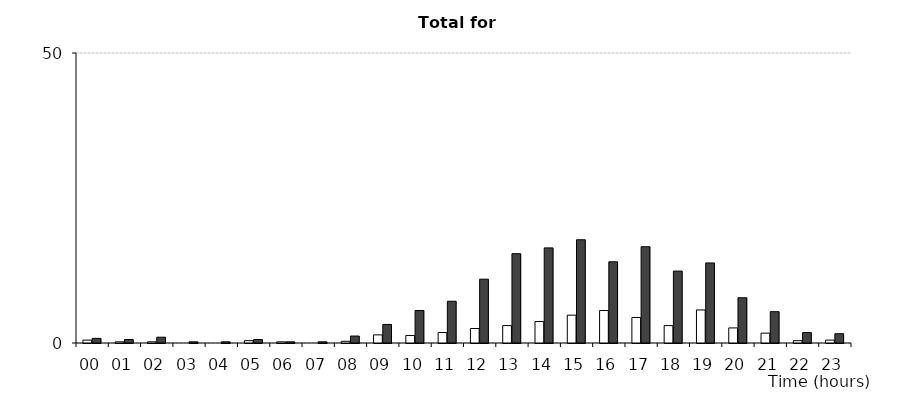
| Category | Killed and adjusted serious | All |
|---|---|---|
| 00 | 0.5 | 0.8 |
| 01 | 0.2 | 0.6 |
| 02 | 0.2 | 1 |
| 03 | 0 | 0.2 |
| 04 | 0 | 0.2 |
| 05 | 0.4 | 0.6 |
| 06 | 0.2 | 0.2 |
| 07 | 0 | 0.2 |
| 08 | 0.3 | 1.2 |
| 09 | 1.4 | 3.2 |
| 10 | 1.3 | 5.6 |
| 11 | 1.8 | 7.2 |
| 12 | 2.5 | 11 |
| 13 | 3 | 15.4 |
| 14 | 3.7 | 16.4 |
| 15 | 4.8 | 17.8 |
| 16 | 5.6 | 14 |
| 17 | 4.4 | 16.6 |
| 18 | 3 | 12.4 |
| 19 | 5.7 | 13.8 |
| 20 | 2.6 | 7.8 |
| 21 | 1.7 | 5.4 |
| 22 | 0.4 | 1.8 |
| 23 | 0.5 | 1.6 |